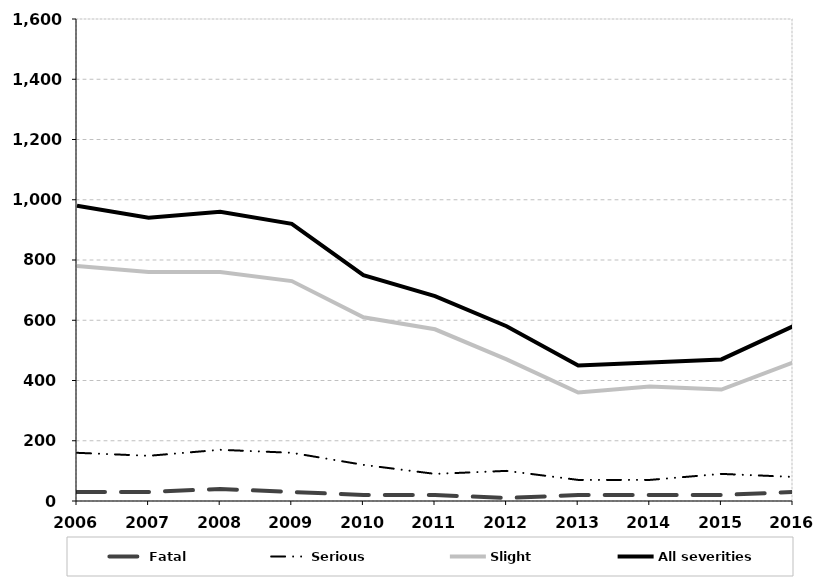
| Category | Fatal | Serious | Slight | All severities |
|---|---|---|---|---|
| 2006.0 | 30 | 160 | 780 | 980 |
| 2007.0 | 30 | 150 | 760 | 940 |
| 2008.0 | 40 | 170 | 760 | 960 |
| 2009.0 | 30 | 160 | 730 | 920 |
| 2010.0 | 20 | 120 | 610 | 750 |
| 2011.0 | 20 | 90 | 570 | 680 |
| 2012.0 | 10 | 100 | 470 | 580 |
| 2013.0 | 20 | 70 | 360 | 450 |
| 2014.0 | 20 | 70 | 380 | 460 |
| 2015.0 | 20 | 90 | 370 | 470 |
| 2016.0 | 30 | 80 | 460 | 580 |